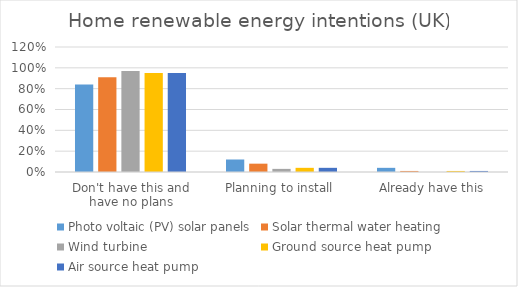
| Category | Photo voltaic (PV) solar panels | Solar thermal water heating | Wind turbine | Ground source heat pump | Air source heat pump |
|---|---|---|---|---|---|
| Don't have this and have no plans | 0.84 | 0.91 | 0.97 | 0.95 | 0.95 |
| Planning to install | 0.12 | 0.08 | 0.03 | 0.04 | 0.04 |
| Already have this | 0.04 | 0.01 | 0 | 0.01 | 0.01 |